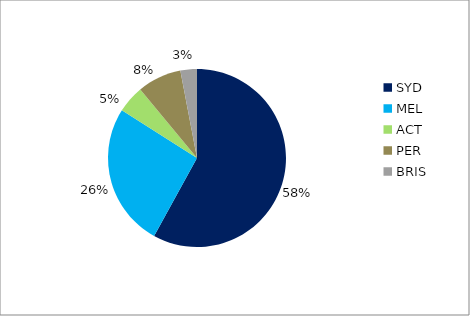
| Category | Series 0 |
|---|---|
| SYD | 0.58 |
| MEL | 0.26 |
| ACT | 0.05 |
| PER | 0.08 |
| BRIS | 0.03 |